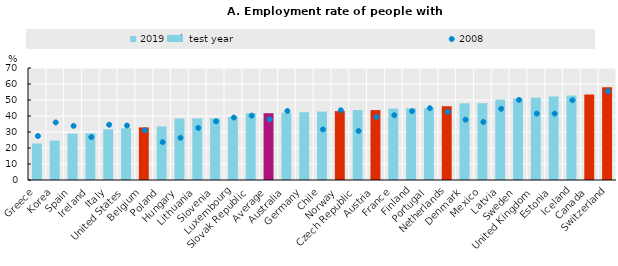
| Category | 2019 or latest year |
|---|---|
| Greece | 22.805 |
| Korea | 24.625 |
| Spain | 28.963 |
| Ireland | 29.231 |
| Italy | 31.688 |
| United States | 32.349 |
| Belgium | 32.885 |
| Poland | 33.455 |
| Hungary | 38.402 |
| Lithuania | 38.515 |
| Slovenia | 38.555 |
| Luxembourg | 39.403 |
| Slovak Republic | 41.714 |
| Average | 41.737 |
| Australia | 42.071 |
| Germany | 42.378 |
| Chile | 42.76 |
| Norway | 43.069 |
| Czech Republic | 43.68 |
| Austria | 43.695 |
| France | 44.648 |
| Finland | 44.791 |
| Portugal | 44.926 |
| Netherlands | 46.103 |
| Denmark | 47.951 |
| Mexico | 47.994 |
| Latvia | 50.234 |
| Sweden | 50.778 |
| United Kingdom | 51.429 |
| Estonia | 52.197 |
| Iceland | 52.789 |
| Canada | 53.5 |
| Switzerland | 57.988 |